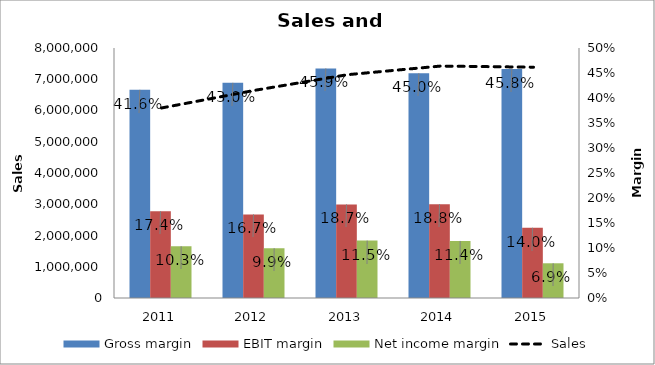
| Category | Gross margin | EBIT margin | Net income margin |
|---|---|---|---|
| 2011.0 | 0.416 | 0.174 | 0.103 |
| 2012.0 | 0.43 | 0.167 | 0.099 |
| 2013.0 | 0.459 | 0.187 | 0.115 |
| 2014.0 | 0.45 | 0.188 | 0.114 |
| 2015.0 | 0.458 | 0.14 | 0.069 |